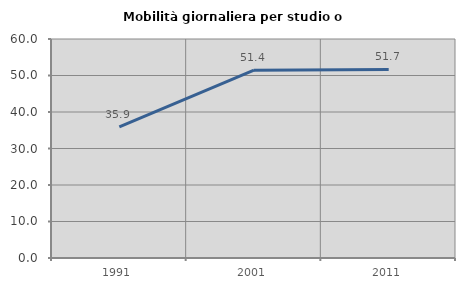
| Category | Mobilità giornaliera per studio o lavoro |
|---|---|
| 1991.0 | 35.935 |
| 2001.0 | 51.441 |
| 2011.0 | 51.656 |